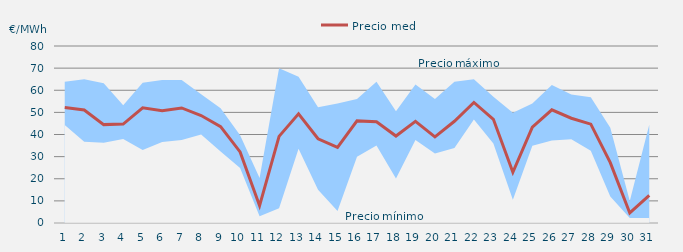
| Category | Precio medio |
|---|---|
| 1.0 | 52.198 |
| 2.0 | 51.068 |
| 3.0 | 44.468 |
| 4.0 | 44.696 |
| 5.0 | 52.033 |
| 6.0 | 50.708 |
| 7.0 | 51.989 |
| 8.0 | 48.592 |
| 9.0 | 43.523 |
| 10.0 | 32.142 |
| 11.0 | 7.834 |
| 12.0 | 39.147 |
| 13.0 | 49.338 |
| 14.0 | 38.06 |
| 15.0 | 34.139 |
| 16.0 | 46.153 |
| 17.0 | 45.794 |
| 18.0 | 39.301 |
| 19.0 | 45.923 |
| 20.0 | 38.94 |
| 21.0 | 45.968 |
| 22.0 | 54.478 |
| 23.0 | 46.871 |
| 24.0 | 22.918 |
| 25.0 | 43.295 |
| 26.0 | 51.167 |
| 27.0 | 47.358 |
| 28.0 | 44.667 |
| 29.0 | 27.293 |
| 30.0 | 4.547 |
| 31.0 | 12.443 |